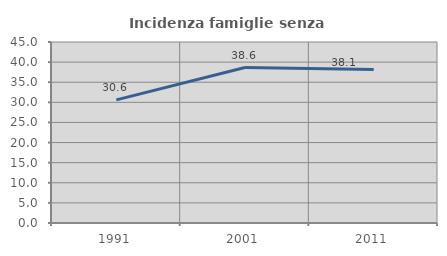
| Category | Incidenza famiglie senza nuclei |
|---|---|
| 1991.0 | 30.618 |
| 2001.0 | 38.641 |
| 2011.0 | 38.143 |